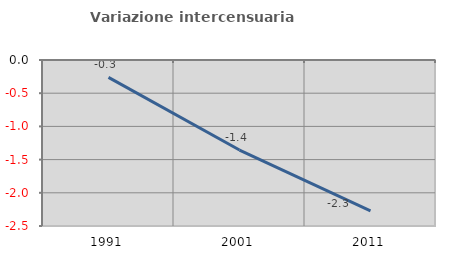
| Category | Variazione intercensuaria annua |
|---|---|
| 1991.0 | -0.261 |
| 2001.0 | -1.356 |
| 2011.0 | -2.274 |